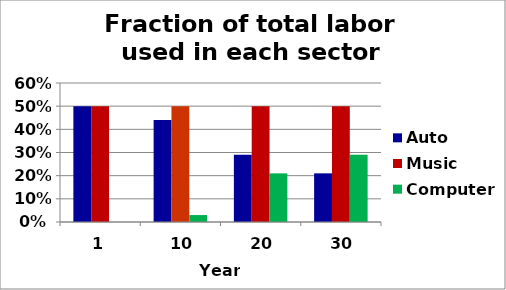
| Category | Auto | Music | Computer |
|---|---|---|---|
| 1.0 | 0.5 | 0.5 | 0 |
| 10.0 | 0.44 | 0.5 | 0.03 |
| 20.0 | 0.29 | 0.5 | 0.21 |
| 30.0 | 0.21 | 0.5 | 0.29 |